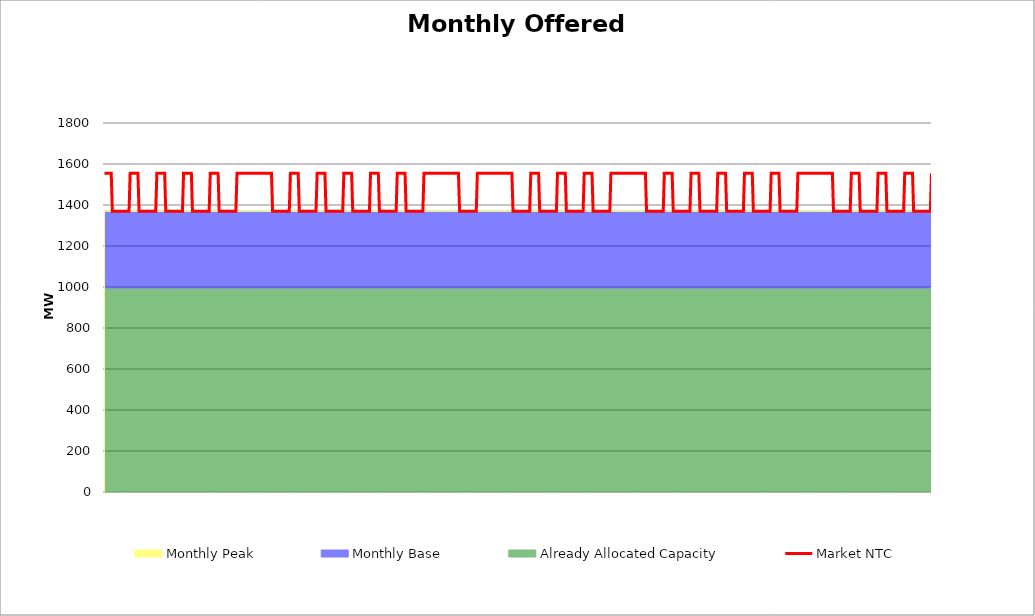
| Category | Market NTC |
|---|---|
| 0 | 1555 |
| 1 | 1555 |
| 2 | 1555 |
| 3 | 1555 |
| 4 | 1555 |
| 5 | 1555 |
| 6 | 1555 |
| 7 | 1370 |
| 8 | 1370 |
| 9 | 1370 |
| 10 | 1370 |
| 11 | 1370 |
| 12 | 1370 |
| 13 | 1370 |
| 14 | 1370 |
| 15 | 1370 |
| 16 | 1370 |
| 17 | 1370 |
| 18 | 1370 |
| 19 | 1370 |
| 20 | 1370 |
| 21 | 1370 |
| 22 | 1370 |
| 23 | 1555 |
| 24 | 1555 |
| 25 | 1555 |
| 26 | 1555 |
| 27 | 1555 |
| 28 | 1555 |
| 29 | 1555 |
| 30 | 1555 |
| 31 | 1370 |
| 32 | 1370 |
| 33 | 1370 |
| 34 | 1370 |
| 35 | 1370 |
| 36 | 1370 |
| 37 | 1370 |
| 38 | 1370 |
| 39 | 1370 |
| 40 | 1370 |
| 41 | 1370 |
| 42 | 1370 |
| 43 | 1370 |
| 44 | 1370 |
| 45 | 1370 |
| 46 | 1370 |
| 47 | 1555 |
| 48 | 1555 |
| 49 | 1555 |
| 50 | 1555 |
| 51 | 1555 |
| 52 | 1555 |
| 53 | 1555 |
| 54 | 1555 |
| 55 | 1370 |
| 56 | 1370 |
| 57 | 1370 |
| 58 | 1370 |
| 59 | 1370 |
| 60 | 1370 |
| 61 | 1370 |
| 62 | 1370 |
| 63 | 1370 |
| 64 | 1370 |
| 65 | 1370 |
| 66 | 1370 |
| 67 | 1370 |
| 68 | 1370 |
| 69 | 1370 |
| 70 | 1370 |
| 71 | 1555 |
| 72 | 1555 |
| 73 | 1555 |
| 74 | 1555 |
| 75 | 1555 |
| 76 | 1555 |
| 77 | 1555 |
| 78 | 1555 |
| 79 | 1370 |
| 80 | 1370 |
| 81 | 1370 |
| 82 | 1370 |
| 83 | 1370 |
| 84 | 1370 |
| 85 | 1370 |
| 86 | 1370 |
| 87 | 1370 |
| 88 | 1370 |
| 89 | 1370 |
| 90 | 1370 |
| 91 | 1370 |
| 92 | 1370 |
| 93 | 1370 |
| 94 | 1370 |
| 95 | 1555 |
| 96 | 1555 |
| 97 | 1555 |
| 98 | 1555 |
| 99 | 1555 |
| 100 | 1555 |
| 101 | 1555 |
| 102 | 1555 |
| 103 | 1370 |
| 104 | 1370 |
| 105 | 1370 |
| 106 | 1370 |
| 107 | 1370 |
| 108 | 1370 |
| 109 | 1370 |
| 110 | 1370 |
| 111 | 1370 |
| 112 | 1370 |
| 113 | 1370 |
| 114 | 1370 |
| 115 | 1370 |
| 116 | 1370 |
| 117 | 1370 |
| 118 | 1370 |
| 119 | 1555 |
| 120 | 1555 |
| 121 | 1555 |
| 122 | 1555 |
| 123 | 1555 |
| 124 | 1555 |
| 125 | 1555 |
| 126 | 1555 |
| 127 | 1555 |
| 128 | 1555 |
| 129 | 1555 |
| 130 | 1555 |
| 131 | 1555 |
| 132 | 1555 |
| 133 | 1555 |
| 134 | 1555 |
| 135 | 1555 |
| 136 | 1555 |
| 137 | 1555 |
| 138 | 1555 |
| 139 | 1555 |
| 140 | 1555 |
| 141 | 1555 |
| 142 | 1555 |
| 143 | 1555 |
| 144 | 1555 |
| 145 | 1555 |
| 146 | 1555 |
| 147 | 1555 |
| 148 | 1555 |
| 149 | 1555 |
| 150 | 1555 |
| 151 | 1370 |
| 152 | 1370 |
| 153 | 1370 |
| 154 | 1370 |
| 155 | 1370 |
| 156 | 1370 |
| 157 | 1370 |
| 158 | 1370 |
| 159 | 1370 |
| 160 | 1370 |
| 161 | 1370 |
| 162 | 1370 |
| 163 | 1370 |
| 164 | 1370 |
| 165 | 1370 |
| 166 | 1370 |
| 167 | 1555 |
| 168 | 1555 |
| 169 | 1555 |
| 170 | 1555 |
| 171 | 1555 |
| 172 | 1555 |
| 173 | 1555 |
| 174 | 1555 |
| 175 | 1370 |
| 176 | 1370 |
| 177 | 1370 |
| 178 | 1370 |
| 179 | 1370 |
| 180 | 1370 |
| 181 | 1370 |
| 182 | 1370 |
| 183 | 1370 |
| 184 | 1370 |
| 185 | 1370 |
| 186 | 1370 |
| 187 | 1370 |
| 188 | 1370 |
| 189 | 1370 |
| 190 | 1370 |
| 191 | 1555 |
| 192 | 1555 |
| 193 | 1555 |
| 194 | 1555 |
| 195 | 1555 |
| 196 | 1555 |
| 197 | 1555 |
| 198 | 1555 |
| 199 | 1370 |
| 200 | 1370 |
| 201 | 1370 |
| 202 | 1370 |
| 203 | 1370 |
| 204 | 1370 |
| 205 | 1370 |
| 206 | 1370 |
| 207 | 1370 |
| 208 | 1370 |
| 209 | 1370 |
| 210 | 1370 |
| 211 | 1370 |
| 212 | 1370 |
| 213 | 1370 |
| 214 | 1370 |
| 215 | 1555 |
| 216 | 1555 |
| 217 | 1555 |
| 218 | 1555 |
| 219 | 1555 |
| 220 | 1555 |
| 221 | 1555 |
| 222 | 1555 |
| 223 | 1370 |
| 224 | 1370 |
| 225 | 1370 |
| 226 | 1370 |
| 227 | 1370 |
| 228 | 1370 |
| 229 | 1370 |
| 230 | 1370 |
| 231 | 1370 |
| 232 | 1370 |
| 233 | 1370 |
| 234 | 1370 |
| 235 | 1370 |
| 236 | 1370 |
| 237 | 1370 |
| 238 | 1370 |
| 239 | 1555 |
| 240 | 1555 |
| 241 | 1555 |
| 242 | 1555 |
| 243 | 1555 |
| 244 | 1555 |
| 245 | 1555 |
| 246 | 1555 |
| 247 | 1370 |
| 248 | 1370 |
| 249 | 1370 |
| 250 | 1370 |
| 251 | 1370 |
| 252 | 1370 |
| 253 | 1370 |
| 254 | 1370 |
| 255 | 1370 |
| 256 | 1370 |
| 257 | 1370 |
| 258 | 1370 |
| 259 | 1370 |
| 260 | 1370 |
| 261 | 1370 |
| 262 | 1370 |
| 263 | 1555 |
| 264 | 1555 |
| 265 | 1555 |
| 266 | 1555 |
| 267 | 1555 |
| 268 | 1555 |
| 269 | 1555 |
| 270 | 1555 |
| 271 | 1370 |
| 272 | 1370 |
| 273 | 1370 |
| 274 | 1370 |
| 275 | 1370 |
| 276 | 1370 |
| 277 | 1370 |
| 278 | 1370 |
| 279 | 1370 |
| 280 | 1370 |
| 281 | 1370 |
| 282 | 1370 |
| 283 | 1370 |
| 284 | 1370 |
| 285 | 1370 |
| 286 | 1370 |
| 287 | 1555 |
| 288 | 1555 |
| 289 | 1555 |
| 290 | 1555 |
| 291 | 1555 |
| 292 | 1555 |
| 293 | 1555 |
| 294 | 1555 |
| 295 | 1555 |
| 296 | 1555 |
| 297 | 1555 |
| 298 | 1555 |
| 299 | 1555 |
| 300 | 1555 |
| 301 | 1555 |
| 302 | 1555 |
| 303 | 1555 |
| 304 | 1555 |
| 305 | 1555 |
| 306 | 1555 |
| 307 | 1555 |
| 308 | 1555 |
| 309 | 1555 |
| 310 | 1555 |
| 311 | 1555 |
| 312 | 1555 |
| 313 | 1555 |
| 314 | 1555 |
| 315 | 1555 |
| 316 | 1555 |
| 317 | 1555 |
| 318 | 1555 |
| 319 | 1370 |
| 320 | 1370 |
| 321 | 1370 |
| 322 | 1370 |
| 323 | 1370 |
| 324 | 1370 |
| 325 | 1370 |
| 326 | 1370 |
| 327 | 1370 |
| 328 | 1370 |
| 329 | 1370 |
| 330 | 1370 |
| 331 | 1370 |
| 332 | 1370 |
| 333 | 1370 |
| 334 | 1370 |
| 335 | 1555 |
| 336 | 1555 |
| 337 | 1555 |
| 338 | 1555 |
| 339 | 1555 |
| 340 | 1555 |
| 341 | 1555 |
| 342 | 1555 |
| 343 | 1555 |
| 344 | 1555 |
| 345 | 1555 |
| 346 | 1555 |
| 347 | 1555 |
| 348 | 1555 |
| 349 | 1555 |
| 350 | 1555 |
| 351 | 1555 |
| 352 | 1555 |
| 353 | 1555 |
| 354 | 1555 |
| 355 | 1555 |
| 356 | 1555 |
| 357 | 1555 |
| 358 | 1555 |
| 359 | 1555 |
| 360 | 1555 |
| 361 | 1555 |
| 362 | 1555 |
| 363 | 1555 |
| 364 | 1555 |
| 365 | 1555 |
| 366 | 1555 |
| 367 | 1370 |
| 368 | 1370 |
| 369 | 1370 |
| 370 | 1370 |
| 371 | 1370 |
| 372 | 1370 |
| 373 | 1370 |
| 374 | 1370 |
| 375 | 1370 |
| 376 | 1370 |
| 377 | 1370 |
| 378 | 1370 |
| 379 | 1370 |
| 380 | 1370 |
| 381 | 1370 |
| 382 | 1370 |
| 383 | 1555 |
| 384 | 1555 |
| 385 | 1555 |
| 386 | 1555 |
| 387 | 1555 |
| 388 | 1555 |
| 389 | 1555 |
| 390 | 1555 |
| 391 | 1370 |
| 392 | 1370 |
| 393 | 1370 |
| 394 | 1370 |
| 395 | 1370 |
| 396 | 1370 |
| 397 | 1370 |
| 398 | 1370 |
| 399 | 1370 |
| 400 | 1370 |
| 401 | 1370 |
| 402 | 1370 |
| 403 | 1370 |
| 404 | 1370 |
| 405 | 1370 |
| 406 | 1370 |
| 407 | 1555 |
| 408 | 1555 |
| 409 | 1555 |
| 410 | 1555 |
| 411 | 1555 |
| 412 | 1555 |
| 413 | 1555 |
| 414 | 1555 |
| 415 | 1370 |
| 416 | 1370 |
| 417 | 1370 |
| 418 | 1370 |
| 419 | 1370 |
| 420 | 1370 |
| 421 | 1370 |
| 422 | 1370 |
| 423 | 1370 |
| 424 | 1370 |
| 425 | 1370 |
| 426 | 1370 |
| 427 | 1370 |
| 428 | 1370 |
| 429 | 1370 |
| 430 | 1370 |
| 431 | 1555 |
| 432 | 1555 |
| 433 | 1555 |
| 434 | 1555 |
| 435 | 1555 |
| 436 | 1555 |
| 437 | 1555 |
| 438 | 1555 |
| 439 | 1370 |
| 440 | 1370 |
| 441 | 1370 |
| 442 | 1370 |
| 443 | 1370 |
| 444 | 1370 |
| 445 | 1370 |
| 446 | 1370 |
| 447 | 1370 |
| 448 | 1370 |
| 449 | 1370 |
| 450 | 1370 |
| 451 | 1370 |
| 452 | 1370 |
| 453 | 1370 |
| 454 | 1370 |
| 455 | 1555 |
| 456 | 1555 |
| 457 | 1555 |
| 458 | 1555 |
| 459 | 1555 |
| 460 | 1555 |
| 461 | 1555 |
| 462 | 1555 |
| 463 | 1555 |
| 464 | 1555 |
| 465 | 1555 |
| 466 | 1555 |
| 467 | 1555 |
| 468 | 1555 |
| 469 | 1555 |
| 470 | 1555 |
| 471 | 1555 |
| 472 | 1555 |
| 473 | 1555 |
| 474 | 1555 |
| 475 | 1555 |
| 476 | 1555 |
| 477 | 1555 |
| 478 | 1555 |
| 479 | 1555 |
| 480 | 1555 |
| 481 | 1555 |
| 482 | 1555 |
| 483 | 1555 |
| 484 | 1555 |
| 485 | 1555 |
| 486 | 1555 |
| 487 | 1370 |
| 488 | 1370 |
| 489 | 1370 |
| 490 | 1370 |
| 491 | 1370 |
| 492 | 1370 |
| 493 | 1370 |
| 494 | 1370 |
| 495 | 1370 |
| 496 | 1370 |
| 497 | 1370 |
| 498 | 1370 |
| 499 | 1370 |
| 500 | 1370 |
| 501 | 1370 |
| 502 | 1370 |
| 503 | 1555 |
| 504 | 1555 |
| 505 | 1555 |
| 506 | 1555 |
| 507 | 1555 |
| 508 | 1555 |
| 509 | 1555 |
| 510 | 1555 |
| 511 | 1370 |
| 512 | 1370 |
| 513 | 1370 |
| 514 | 1370 |
| 515 | 1370 |
| 516 | 1370 |
| 517 | 1370 |
| 518 | 1370 |
| 519 | 1370 |
| 520 | 1370 |
| 521 | 1370 |
| 522 | 1370 |
| 523 | 1370 |
| 524 | 1370 |
| 525 | 1370 |
| 526 | 1370 |
| 527 | 1555 |
| 528 | 1555 |
| 529 | 1555 |
| 530 | 1555 |
| 531 | 1555 |
| 532 | 1555 |
| 533 | 1555 |
| 534 | 1555 |
| 535 | 1370 |
| 536 | 1370 |
| 537 | 1370 |
| 538 | 1370 |
| 539 | 1370 |
| 540 | 1370 |
| 541 | 1370 |
| 542 | 1370 |
| 543 | 1370 |
| 544 | 1370 |
| 545 | 1370 |
| 546 | 1370 |
| 547 | 1370 |
| 548 | 1370 |
| 549 | 1370 |
| 550 | 1370 |
| 551 | 1555 |
| 552 | 1555 |
| 553 | 1555 |
| 554 | 1555 |
| 555 | 1555 |
| 556 | 1555 |
| 557 | 1555 |
| 558 | 1555 |
| 559 | 1370 |
| 560 | 1370 |
| 561 | 1370 |
| 562 | 1370 |
| 563 | 1370 |
| 564 | 1370 |
| 565 | 1370 |
| 566 | 1370 |
| 567 | 1370 |
| 568 | 1370 |
| 569 | 1370 |
| 570 | 1370 |
| 571 | 1370 |
| 572 | 1370 |
| 573 | 1370 |
| 574 | 1370 |
| 575 | 1555 |
| 576 | 1555 |
| 577 | 1555 |
| 578 | 1555 |
| 579 | 1555 |
| 580 | 1555 |
| 581 | 1555 |
| 582 | 1555 |
| 583 | 1370 |
| 584 | 1370 |
| 585 | 1370 |
| 586 | 1370 |
| 587 | 1370 |
| 588 | 1370 |
| 589 | 1370 |
| 590 | 1370 |
| 591 | 1370 |
| 592 | 1370 |
| 593 | 1370 |
| 594 | 1370 |
| 595 | 1370 |
| 596 | 1370 |
| 597 | 1370 |
| 598 | 1370 |
| 599 | 1555 |
| 600 | 1555 |
| 601 | 1555 |
| 602 | 1555 |
| 603 | 1555 |
| 604 | 1555 |
| 605 | 1555 |
| 606 | 1555 |
| 607 | 1370 |
| 608 | 1370 |
| 609 | 1370 |
| 610 | 1370 |
| 611 | 1370 |
| 612 | 1370 |
| 613 | 1370 |
| 614 | 1370 |
| 615 | 1370 |
| 616 | 1370 |
| 617 | 1370 |
| 618 | 1370 |
| 619 | 1370 |
| 620 | 1370 |
| 621 | 1370 |
| 622 | 1370 |
| 623 | 1555 |
| 624 | 1555 |
| 625 | 1555 |
| 626 | 1555 |
| 627 | 1555 |
| 628 | 1555 |
| 629 | 1555 |
| 630 | 1555 |
| 631 | 1555 |
| 632 | 1555 |
| 633 | 1555 |
| 634 | 1555 |
| 635 | 1555 |
| 636 | 1555 |
| 637 | 1555 |
| 638 | 1555 |
| 639 | 1555 |
| 640 | 1555 |
| 641 | 1555 |
| 642 | 1555 |
| 643 | 1555 |
| 644 | 1555 |
| 645 | 1555 |
| 646 | 1555 |
| 647 | 1555 |
| 648 | 1555 |
| 649 | 1555 |
| 650 | 1555 |
| 651 | 1555 |
| 652 | 1555 |
| 653 | 1555 |
| 654 | 1555 |
| 655 | 1370 |
| 656 | 1370 |
| 657 | 1370 |
| 658 | 1370 |
| 659 | 1370 |
| 660 | 1370 |
| 661 | 1370 |
| 662 | 1370 |
| 663 | 1370 |
| 664 | 1370 |
| 665 | 1370 |
| 666 | 1370 |
| 667 | 1370 |
| 668 | 1370 |
| 669 | 1370 |
| 670 | 1370 |
| 671 | 1555 |
| 672 | 1555 |
| 673 | 1555 |
| 674 | 1555 |
| 675 | 1555 |
| 676 | 1555 |
| 677 | 1555 |
| 678 | 1555 |
| 679 | 1370 |
| 680 | 1370 |
| 681 | 1370 |
| 682 | 1370 |
| 683 | 1370 |
| 684 | 1370 |
| 685 | 1370 |
| 686 | 1370 |
| 687 | 1370 |
| 688 | 1370 |
| 689 | 1370 |
| 690 | 1370 |
| 691 | 1370 |
| 692 | 1370 |
| 693 | 1370 |
| 694 | 1370 |
| 695 | 1555 |
| 696 | 1555 |
| 697 | 1555 |
| 698 | 1555 |
| 699 | 1555 |
| 700 | 1555 |
| 701 | 1555 |
| 702 | 1555 |
| 703 | 1370 |
| 704 | 1370 |
| 705 | 1370 |
| 706 | 1370 |
| 707 | 1370 |
| 708 | 1370 |
| 709 | 1370 |
| 710 | 1370 |
| 711 | 1370 |
| 712 | 1370 |
| 713 | 1370 |
| 714 | 1370 |
| 715 | 1370 |
| 716 | 1370 |
| 717 | 1370 |
| 718 | 1370 |
| 719 | 1555 |
| 720 | 1555 |
| 721 | 1555 |
| 722 | 1555 |
| 723 | 1555 |
| 724 | 1555 |
| 725 | 1555 |
| 726 | 1555 |
| 727 | 1370 |
| 728 | 1370 |
| 729 | 1370 |
| 730 | 1370 |
| 731 | 1370 |
| 732 | 1370 |
| 733 | 1370 |
| 734 | 1370 |
| 735 | 1370 |
| 736 | 1370 |
| 737 | 1370 |
| 738 | 1370 |
| 739 | 1370 |
| 740 | 1370 |
| 741 | 1370 |
| 742 | 1370 |
| 743 | 1555 |